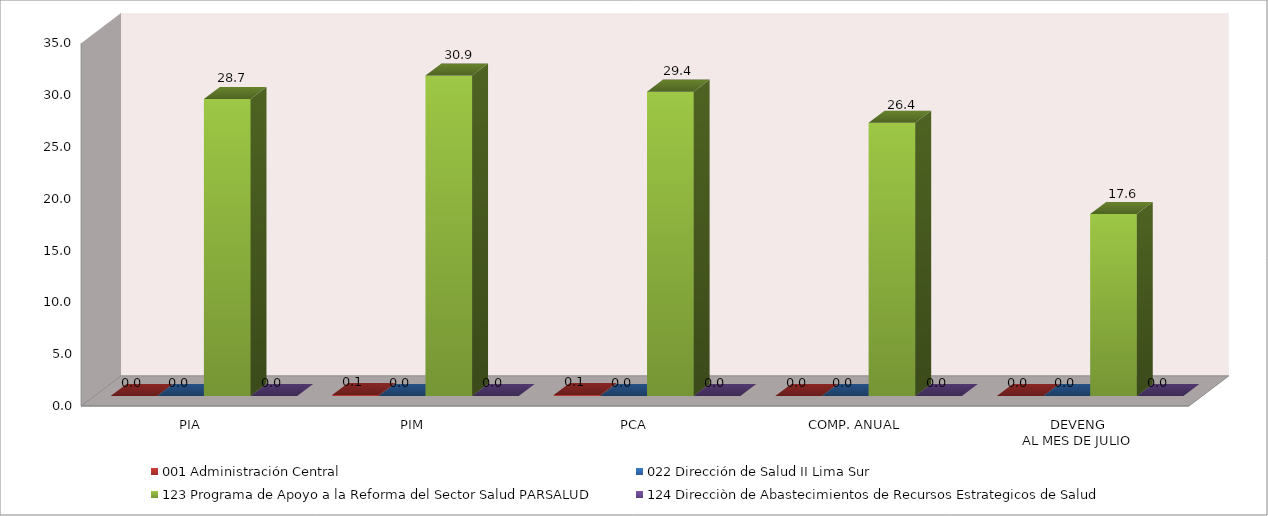
| Category | 001 Administración Central | 022 Dirección de Salud II Lima Sur | 123 Programa de Apoyo a la Reforma del Sector Salud PARSALUD | 124 Direcciòn de Abastecimientos de Recursos Estrategicos de Salud |
|---|---|---|---|---|
| PIA | 0 | 0 | 28.656 | 0 |
| PIM | 0.095 | 0 | 30.911 | 0 |
| PCA | 0.09 | 0 | 29.365 | 0 |
| COMP. ANUAL | 0 | 0 | 26.357 | 0 |
| DEVENG
AL MES DE JULIO | 0 | 0 | 17.552 | 0 |